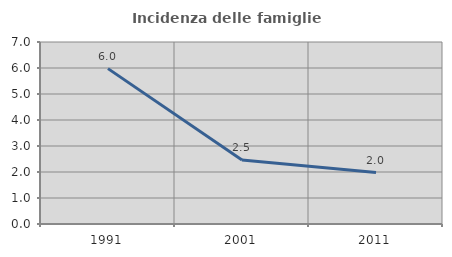
| Category | Incidenza delle famiglie numerose |
|---|---|
| 1991.0 | 5.976 |
| 2001.0 | 2.459 |
| 2011.0 | 1.976 |